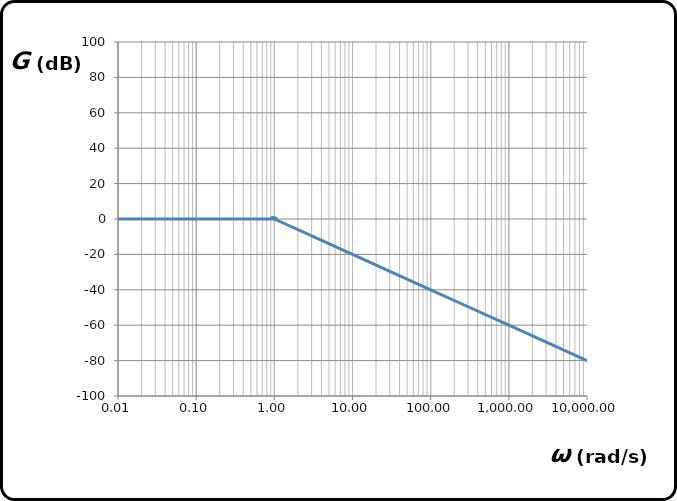
| Category | 1 |
|---|---|
| 9.9e-07 | 0 |
| 1e-06 | 0 |
| 9.9e-06 | 0 |
| 1e-05 | 0 |
| 9.99e-05 | 0 |
| 0.0001 | 0 |
| 0.00099 | 0 |
| 0.001 | 0 |
| 0.0099 | 0 |
| 0.01 | 0 |
| 0.0999 | 0 |
| 0.1 | 0 |
| 0.99 | 0 |
| 1.0 | 0 |
| 9.99 | -20 |
| 10.0 | -20 |
| 99.99 | -40 |
| 100.0 | -40 |
| 999.99 | -60 |
| 1000.0 | -60 |
| 9999.99 | -80 |
| 10000.0 | -80 |
| 99999.99 | -100 |
| 100000.0 | -100 |
| 999999.99 | -120 |
| 1000000.0 | -120 |